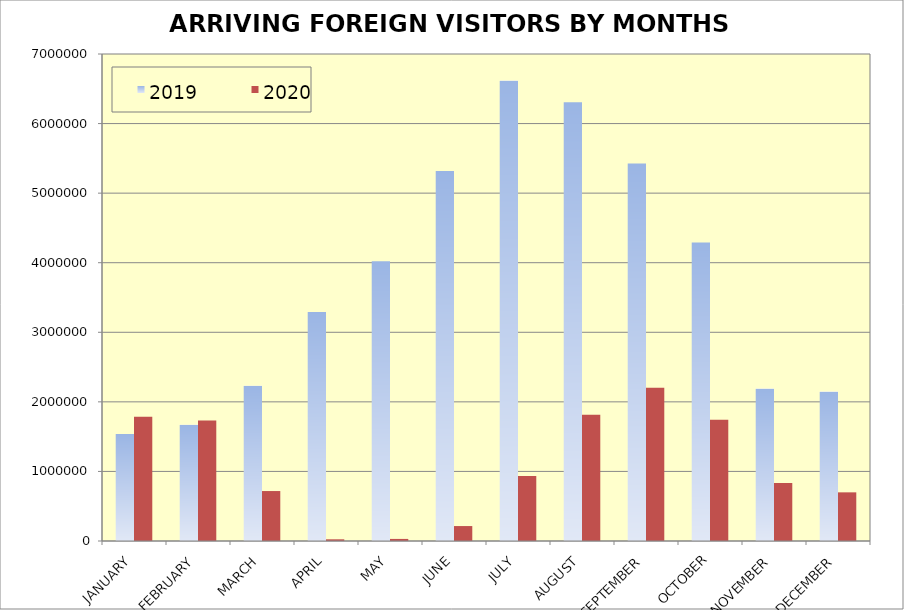
| Category | 2019 | 2020 |
|---|---|---|
| JANUARY | 1539496 | 1787435 |
| FEBRUARY | 1670238 | 1733112 |
| MARCH | 2232358 | 718097 |
| APRIL | 3293176 | 24238 |
| MAY | 4022254 | 29829 |
| JUNE | 5318984 | 214768 |
| JULY | 6617380 | 932927 |
| AUGUST | 6307508 | 1814701 |
| SEPTEMBER | 5426818 | 2203482 |
| OCTOBER | 4291574 | 1742303 |
| NOVEMBER | 2190622 | 833991 |
| DECEMBER | 2147878 | 699330 |